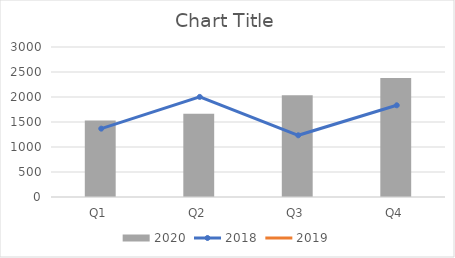
| Category | 2020 |
|---|---|
| Q1 | 1531 |
| Q2 | 1663 |
| Q3 | 2034 |
| Q4 | 2381 |